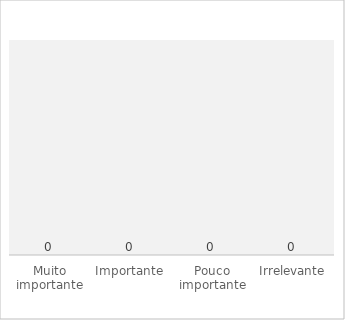
| Category | Volume |
|---|---|
| Muito importante | 0 |
| Importante | 0 |
| Pouco importante | 0 |
| Irrelevante | 0 |